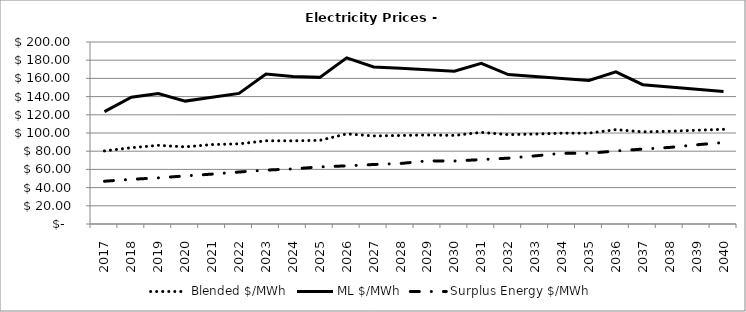
| Category | Blended $/MWh | ML $/MWh | Surplus Energy $/MWh |
|---|---|---|---|
| 2017.0 | 80.32 | 123.536 | 46.993 |
| 2018.0 | 83.845 | 139.278 | 49.119 |
| 2019.0 | 86.426 | 143.318 | 50.685 |
| 2020.0 | 84.752 | 135.056 | 52.861 |
| 2021.0 | 87.3 | 139.176 | 54.837 |
| 2022.0 | 88.088 | 143.531 | 57.127 |
| 2023.0 | 91.456 | 164.791 | 59.224 |
| 2024.0 | 91.371 | 161.97 | 60.528 |
| 2025.0 | 91.954 | 161.136 | 62.759 |
| 2026.0 | 98.995 | 182.59 | 63.883 |
| 2027.0 | 96.816 | 172.501 | 65.393 |
| 2028.0 | 97.273 | 171.127 | 66.497 |
| 2029.0 | 97.832 | 169.591 | 69.391 |
| 2030.0 | 97.331 | 167.912 | 69.227 |
| 2031.0 | 100.706 | 176.512 | 70.787 |
| 2032.0 | 98.19 | 164.167 | 72.35 |
| 2033.0 | 98.843 | 162.134 | 74.875 |
| 2034.0 | 99.825 | 159.998 | 77.685 |
| 2035.0 | 99.83 | 157.773 | 77.719 |
| 2036.0 | 103.704 | 167.246 | 80.257 |
| 2037.0 | 101.287 | 153.083 | 82.309 |
| 2038.0 | 101.925 | 150.646 | 84.171 |
| 2039.0 | 103.01 | 148.144 | 87.039 |
| 2040.0 | 104.059 | 145.59 | 89.566 |